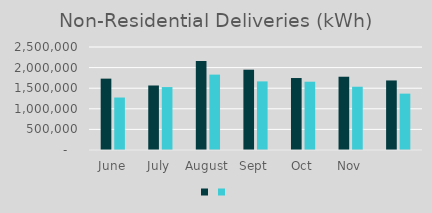
| Category | Series 1 | Series 0 |
|---|---|---|
| June | 1732026 | 1273660 |
| July | 1565715 | 1527956 |
| August | 2157982 | 1829758 |
| Sept | 1948950 | 1665239 |
| Oct | 1746850 | 1657467 |
| Nov | 1778480 | 1535448 |